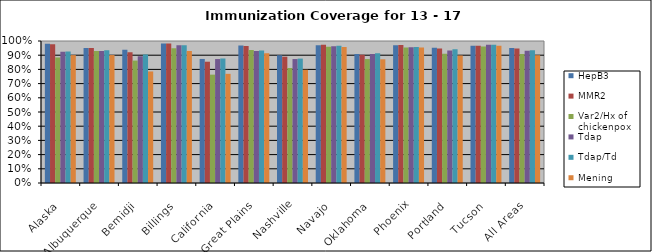
| Category | HepB3 | MMR2 | Var2/Hx of chickenpox | Tdap | Tdap/Td | Mening |
|---|---|---|---|---|---|---|
| Alaska | 0.981 | 0.978 | 0.884 | 0.924 | 0.926 | 0.901 |
| Albuquerque | 0.951 | 0.952 | 0.929 | 0.929 | 0.935 | 0.901 |
| Bemidji | 0.938 | 0.921 | 0.862 | 0.893 | 0.905 | 0.785 |
| Billings | 0.983 | 0.983 | 0.95 | 0.97 | 0.971 | 0.93 |
| California | 0.874 | 0.854 | 0.763 | 0.873 | 0.877 | 0.769 |
| Great Plains | 0.968 | 0.965 | 0.937 | 0.93 | 0.933 | 0.914 |
| Nashville | 0.899 | 0.889 | 0.81 | 0.873 | 0.876 | 0.798 |
| Navajo | 0.97 | 0.973 | 0.959 | 0.962 | 0.966 | 0.958 |
| Oklahoma | 0.909 | 0.903 | 0.873 | 0.909 | 0.914 | 0.871 |
| Phoenix | 0.97 | 0.971 | 0.954 | 0.955 | 0.959 | 0.954 |
| Portland | 0.953 | 0.947 | 0.911 | 0.932 | 0.942 | 0.898 |
| Tucson | 0.967 | 0.967 | 0.961 | 0.973 | 0.973 | 0.966 |
| All Areas | 0.951 | 0.948 | 0.908 | 0.931 | 0.935 | 0.9 |